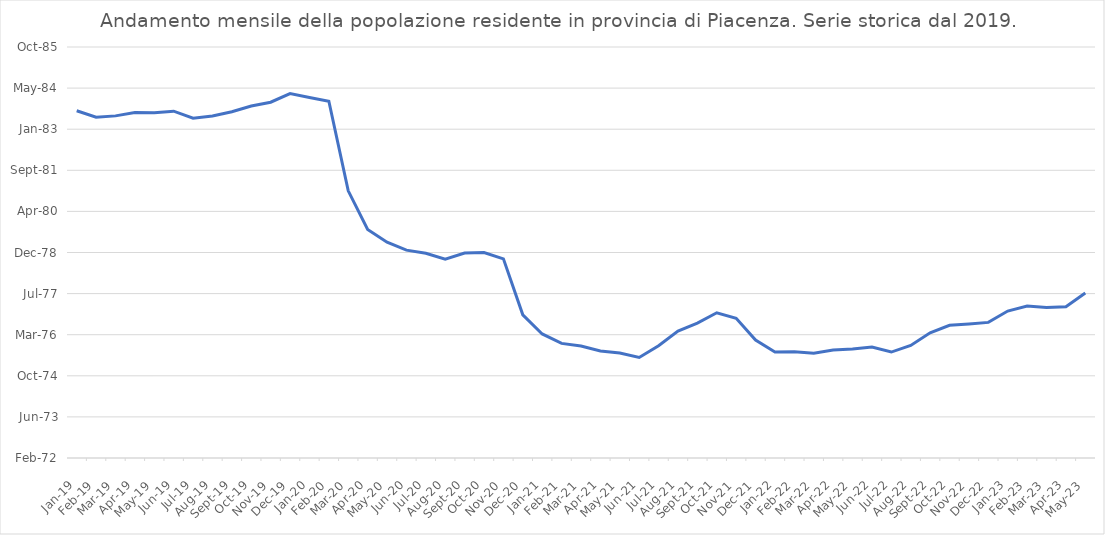
| Category | Series 1 | Series 0 |
|---|---|---|
| 2019-01-01 | 286225 | 2019-01-01 |
| 2019-02-01 | 286146 | 2019-02-01 |
| 2019-03-01 | 286162 | 2019-03-01 |
| 2019-04-01 | 286203 | 2019-04-01 |
| 2019-05-01 | 286201 | 2019-05-01 |
| 2019-06-01 | 286219 | 2019-06-01 |
| 2019-07-01 | 286133 | 2019-07-01 |
| 2019-08-01 | 286161 | 2019-08-01 |
| 2019-09-01 | 286213 | 2019-09-01 |
| 2019-10-01 | 286282 | 2019-10-01 |
| 2019-11-01 | 286328 | 2019-11-01 |
| 2019-12-01 | 286433 | 2019-12-01 |
| 2020-01-01 | 286386 | 2020-01-01 |
| 2020-02-01 | 286340 | 2020-02-01 |
| 2020-03-01 | 285250 | 2020-03-01 |
| 2020-04-01 | 284781 | 2020-04-01 |
| 2020-05-01 | 284626 | 2020-05-01 |
| 2020-06-01 | 284529 | 2020-06-01 |
| 2020-07-01 | 284491 | 2020-07-01 |
| 2020-08-01 | 284420 | 2020-08-01 |
| 2020-09-01 | 284494 | 2020-09-01 |
| 2020-10-01 | 284500 | 2020-10-01 |
| 2020-11-01 | 284423 | 2020-11-01 |
| 2020-12-01 | 283742 | 2020-12-01 |
| 2021-01-01 | 283509 | 2021-01-01 |
| 2021-02-01 | 283394 | 2021-02-01 |
| 2021-03-01 | 283362 | 2021-03-01 |
| 2021-04-01 | 283302 | 2021-04-01 |
| 2021-05-01 | 283277 | 2021-05-01 |
| 2021-06-01 | 283223 | 2021-06-01 |
| 2021-07-01 | 283366 | 2021-07-01 |
| 2021-08-01 | 283544 | 2021-08-01 |
| 2021-09-01 | 283642 | 2021-09-01 |
| 2021-10-01 | 283767 | 2021-10-01 |
| 2021-11-01 | 283700 | 2021-11-01 |
| 2021-12-01 | 283435 | 2021-12-01 |
| 2022-01-01 | 283290 | 2022-01-01 |
| 2022-02-01 | 283294 | 2022-02-01 |
| 2022-03-01 | 283275 | 2022-03-01 |
| 2022-04-01 | 283313 | 2022-04-01 |
| 2022-05-01 | 283326 | 2022-05-01 |
| 2022-06-01 | 283351 | 2022-06-01 |
| 2022-07-01 | 283289 | 2022-07-01 |
| 2022-08-01 | 283370 | 2022-08-01 |
| 2022-09-01 | 283524 | 2022-09-01 |
| 2022-10-01 | 283615 | 2022-10-01 |
| 2022-11-01 | 283630 | 2022-11-01 |
| 2022-12-01 | 283650 | 2022-12-01 |
| 2023-01-01 | 283788 | 2023-01-01 |
| 2023-02-01 | 283849 | 2023-02-01 |
| 2023-03-01 | 283830 | 2023-03-01 |
| 2023-04-01 | 283841 | 2023-04-01 |
| 2023-05-01 | 284008 | 2023-05-01 |